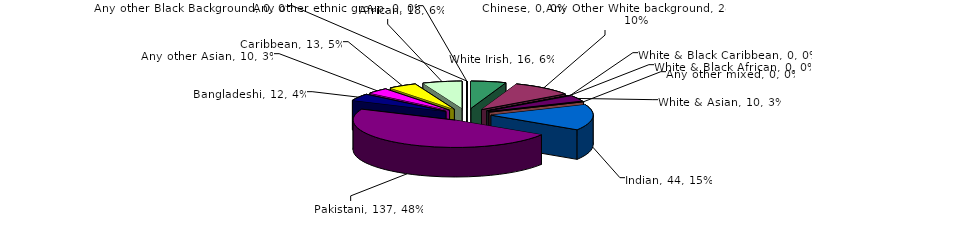
| Category | Series 0 |
|---|---|
| White Irish | 16 |
| Any Other White background | 28 |
| White & Black Caribbean | 0 |
| White & Black African | 0 |
| White & Asian | 10 |
| Any other mixed | 0 |
| Indian | 44 |
| Pakistani | 137 |
| Bangladeshi | 12 |
| Any other Asian | 10 |
| Caribbean | 13 |
| African | 18 |
| Any other Black Background | 0 |
| Chinese | 0 |
| Any other ethnic group | 0 |